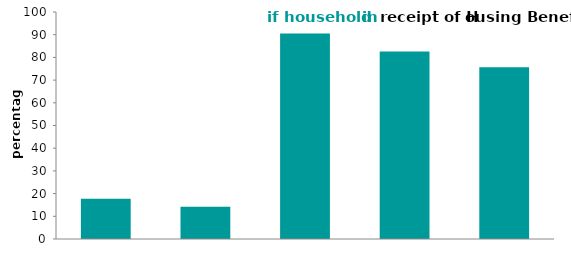
| Category | receiving housing benefit |
|---|---|
| weekly income 
£500 or more | 17.703 |
| full-time 
work | 14.251 |
| unemployed | 90.504 |
| lone parent,
dependent children | 82.599 |
| long-term
 illness | 75.695 |